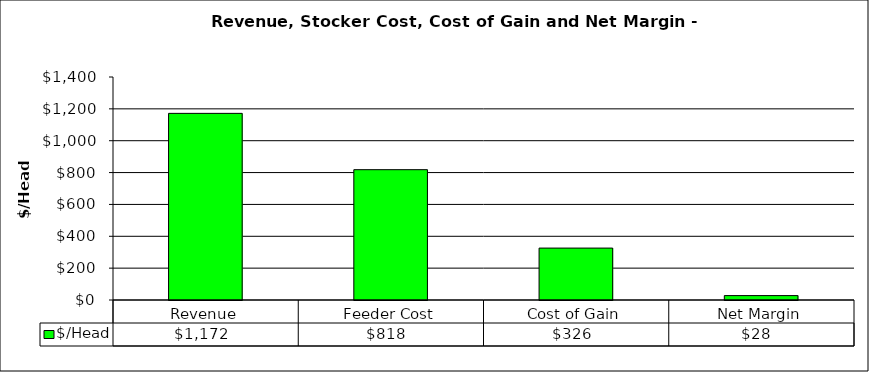
| Category | $/Head |
|---|---|
| Revenue | 1171.717 |
| Feeder Cost | 818.182 |
| Cost of Gain | 325.919 |
| Net Margin | 27.616 |